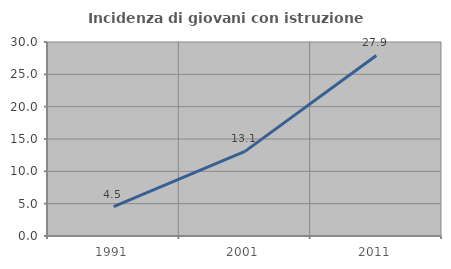
| Category | Incidenza di giovani con istruzione universitaria |
|---|---|
| 1991.0 | 4.545 |
| 2001.0 | 13.081 |
| 2011.0 | 27.921 |